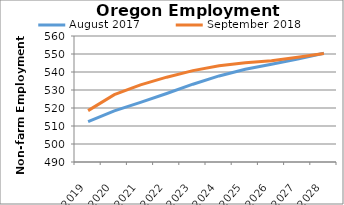
| Category | August 2017 | September 2018 |
|---|---|---|
| 2019.0 | 512.455 | 518.545 |
| 2020.0 | 518.397 | 527.392 |
| 2021.0 | 523.138 | 532.842 |
| 2022.0 | 528.08 | 537.126 |
| 2023.0 | 533.223 | 540.778 |
| 2024.0 | 537.817 | 543.486 |
| 2025.0 | 541.526 | 545.127 |
| 2026.0 | 544.33 | 546.265 |
| 2027.0 | 547.208 | 548.147 |
| 2028.0 | 550.402 | 550.33 |